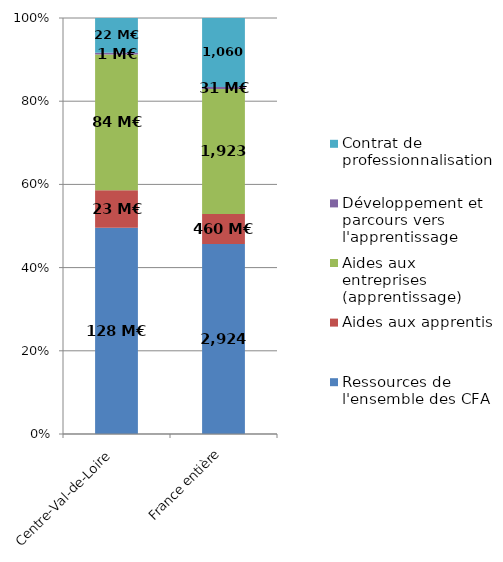
| Category | Ressources de l'ensemble des CFA | Aides aux apprentis | Aides aux entreprises (apprentissage) | Développement et parcours vers l'apprentissage | Contrat de professionnalisation |
|---|---|---|---|---|---|
| Centre-Val-de-Loire | 128.354 | 23.285 | 84.461 | 1.124 | 21.657 |
| France entière | 2924.219 | 459.796 | 1923.184 | 31.421 | 1060.48 |